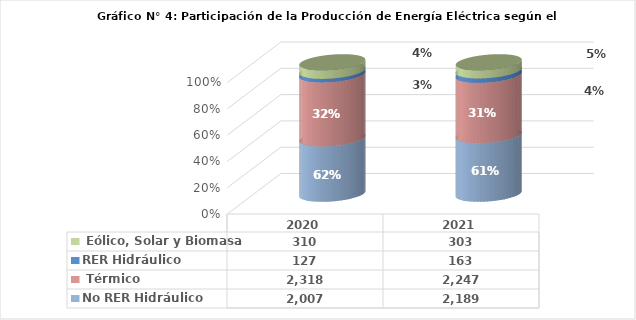
| Category | No RER | RER |
|---|---|---|
| 2020.0 | 2317.707 | 310.418 |
| 2021.0 | 2246.659 | 303.01 |